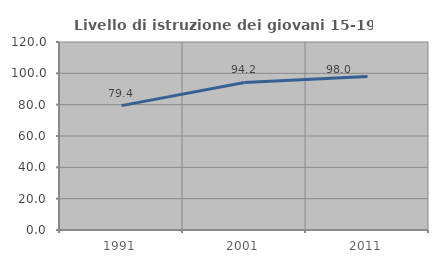
| Category | Livello di istruzione dei giovani 15-19 anni |
|---|---|
| 1991.0 | 79.373 |
| 2001.0 | 94.152 |
| 2011.0 | 97.998 |